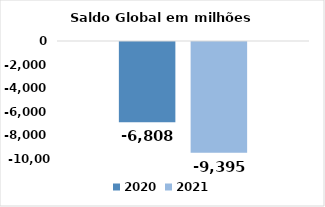
| Category | 2020 | 2021 |
|---|---|---|
|  | -6807.852 | -9395.378 |